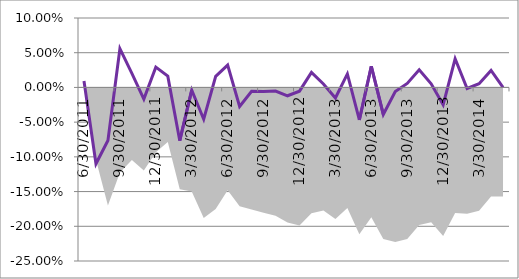
| Category | Series 1 |
|---|---|
| 0 | 0.009 |
| 01/01/1900 | -0.11 |
| 02/01/1900 | -0.077 |
| 03/01/1900 | 0.056 |
| 04/01/1900 | 0.02 |
| 05/01/1900 | -0.017 |
| 06/01/1900 | 0.029 |
| 07/01/1900 | 0.016 |
| 08/01/1900 | -0.077 |
| 09/01/1900 | -0.004 |
| 10/01/1900 | -0.046 |
| 11/01/1900 | 0.016 |
| 12/01/1900 | 0.032 |
| 13/01/1900 | -0.027 |
| 14/01/1900 | -0.006 |
| 15/01/1900 | -0.006 |
| 16/01/1900 | -0.005 |
| 17/01/1900 | -0.012 |
| 18/01/1900 | -0.005 |
| 19/01/1900 | 0.022 |
| 20/01/1900 | 0.005 |
| 21/01/1900 | -0.015 |
| 22/01/1900 | 0.019 |
| 23/01/1900 | -0.047 |
| 24/01/1900 | 0.03 |
| 25/01/1900 | -0.039 |
| 26/01/1900 | -0.006 |
| 27/01/1900 | 0.006 |
| 28/01/1900 | 0.025 |
| 29/01/1900 | 0.005 |
| 30/01/1900 | -0.025 |
| 31/01/1900 | 0.041 |
| 01/02/1900 | -0.001 |
| 02/02/1900 | 0.005 |
| 03/02/1900 | 0.025 |
| 04/02/1900 | 0 |